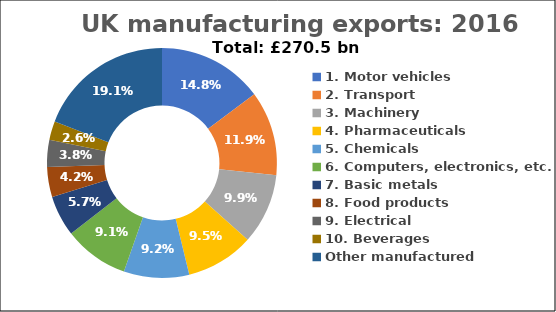
| Category | Series 0 |
|---|---|
| 1. Motor vehicles  | 40.073 |
| 2. Transport | 32.154 |
| 3. Machinery | 26.885 |
| 4. Pharmaceuticals | 25.828 |
| 5. Chemicals  | 24.861 |
| 6. Computers, electronics, etc. | 24.711 |
| 7. Basic metals | 15.477 |
| 8. Food products | 11.366 |
| 9. Electrical | 10.32 |
| 10. Beverages | 7.085 |
| Other manufactured | 51.765 |